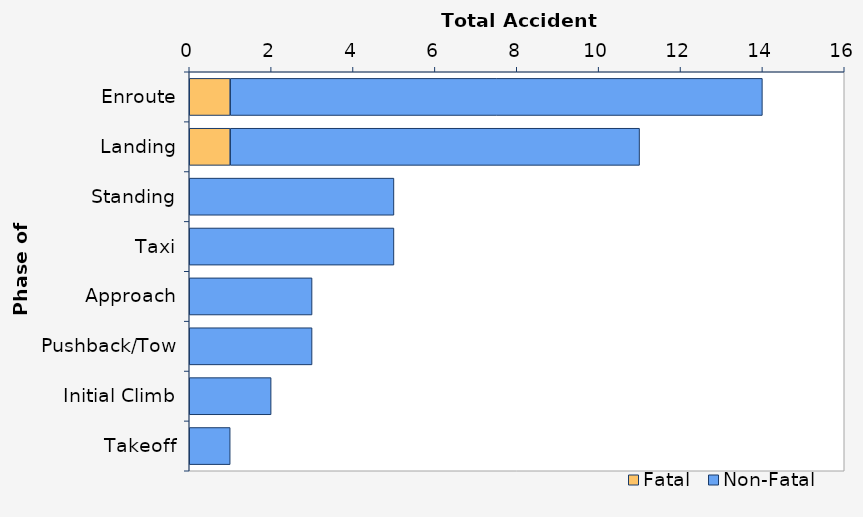
| Category | Fatal | Non-Fatal |
|---|---|---|
| Enroute | 1 | 13 |
| Landing | 1 | 10 |
| Standing | 0 | 5 |
| Taxi | 0 | 5 |
| Approach | 0 | 3 |
| Pushback/Tow | 0 | 3 |
| Initial Climb | 0 | 2 |
| Takeoff | 0 | 1 |